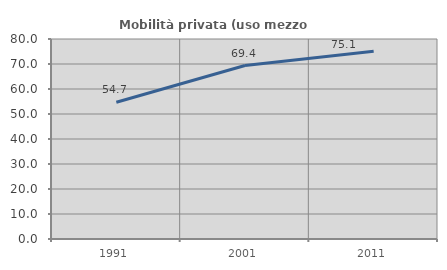
| Category | Mobilità privata (uso mezzo privato) |
|---|---|
| 1991.0 | 54.713 |
| 2001.0 | 69.393 |
| 2011.0 | 75.08 |